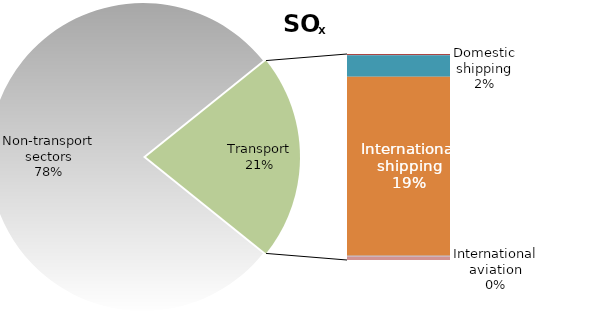
| Category | Series 0 |
|---|---|
| Non-transport sectors | 6147.045 |
| Road transport exhaust | 7.985 |
| Road transport non-exhaust | 0 |
| Railways | 2.623 |
| Domestic shipping | 175.771 |
| International shipping | 1466.822 |
| Domestic aviation | 5.789 |
| International aviation | 29.585 |